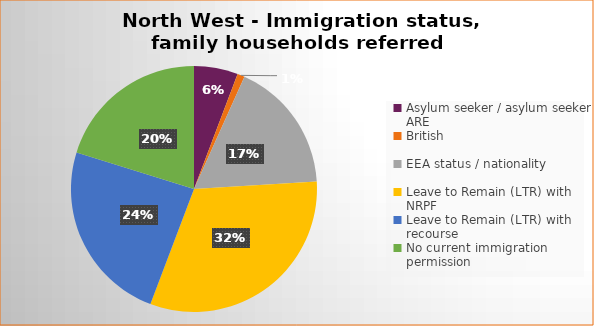
| Category | Number  | Percentage |
|---|---|---|
| Asylum seeker / asylum seeker ARE | 6 | 0.058 |
| British | 1 | 0.01 |
| EEA status / nationality  | 18 | 0.173 |
| Leave to Remain (LTR) with NRPF | 33 | 0.317 |
| Leave to Remain (LTR) with recourse | 25 | 0.24 |
| No current immigration permission | 21 | 0.202 |